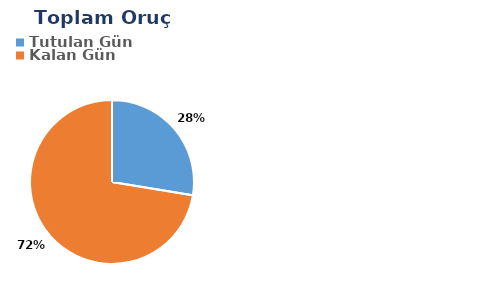
| Category | Toplam |
|---|---|
| Tutulan Gün | 8 |
| Kalan Gün | 21 |